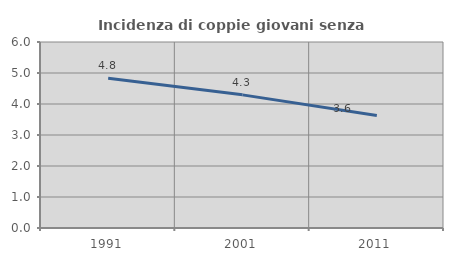
| Category | Incidenza di coppie giovani senza figli |
|---|---|
| 1991.0 | 4.829 |
| 2001.0 | 4.295 |
| 2011.0 | 3.627 |